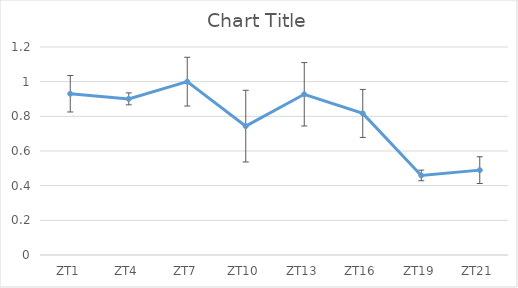
| Category | Series 0 |
|---|---|
| ZT1 | 0.93 |
| ZT4 | 0.901 |
| ZT7 | 1 |
| ZT10 | 0.743 |
| ZT13 | 0.927 |
| ZT16 | 0.817 |
| ZT19 | 0.459 |
| ZT21 | 0.49 |